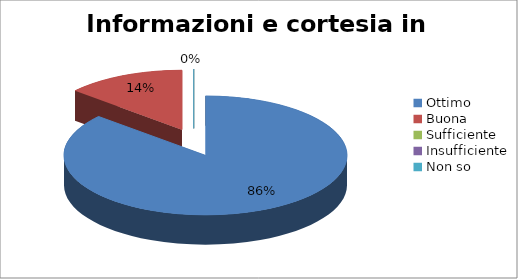
| Category | Informazioni e cortesia in accettazione |
|---|---|
| Ottimo | 38 |
| Buona | 6 |
| Sufficiente | 0 |
| Insufficiente | 0 |
| Non so | 0 |